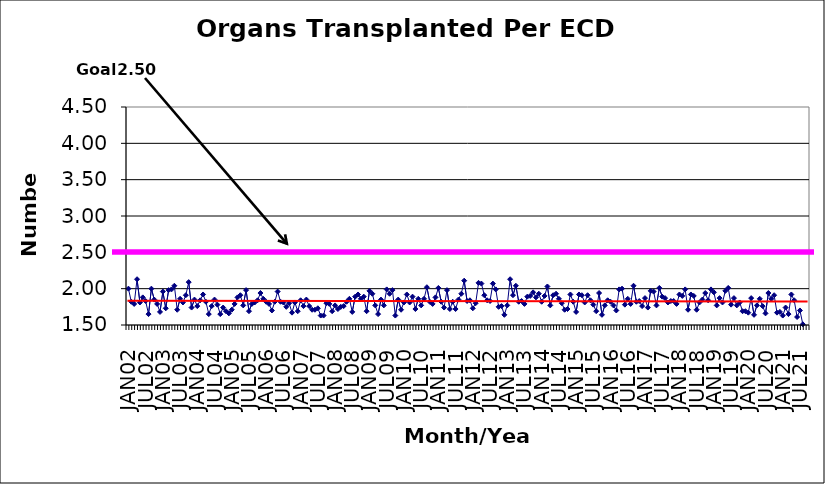
| Category | Series 0 |
|---|---|
| JAN02 | 2 |
| FEB02 | 1.82 |
| MAR02 | 1.79 |
| APR02 | 2.13 |
| MAY02 | 1.81 |
| JUN02 | 1.88 |
| JUL02 | 1.83 |
| AUG02 | 1.65 |
| SEP02 | 2 |
| OCT02 | 1.85 |
| NOV02 | 1.79 |
| DEC02 | 1.68 |
| JAN03 | 1.96 |
| FEB03 | 1.73 |
| MAR03 | 1.98 |
| APR03 | 1.99 |
| MAY03 | 2.04 |
| JUN03 | 1.71 |
| JUL03 | 1.86 |
| AUG03 | 1.81 |
| SEP03 | 1.91 |
| OCT03 | 2.09 |
| NOV03 | 1.74 |
| DEC03 | 1.85 |
| JAN04 | 1.76 |
| FEB04 | 1.84 |
| MAR04 | 1.92 |
| APR04 | 1.82 |
| MAY04 | 1.65 |
| JUN04 | 1.76 |
| JUL04 | 1.85 |
| AUG04 | 1.78 |
| SEP04 | 1.65 |
| OCT04 | 1.74 |
| NOV04 | 1.69 |
| DEC04 | 1.66 |
| JAN05 | 1.71 |
| FEB05 | 1.79 |
| MAR05 | 1.88 |
| APR05 | 1.91 |
| MAY05 | 1.77 |
| JUN05 | 1.98 |
| JUL05 | 1.69 |
| AUG05 | 1.79 |
| SEP05 | 1.81 |
| OCT05 | 1.84 |
| NOV05 | 1.94 |
| DEC05 | 1.86 |
| JAN06 | 1.82 |
| FEB06 | 1.79 |
| MAR06 | 1.7 |
| APR06 | 1.82 |
| MAY06 | 1.96 |
| JUN06 | 1.82 |
| JUL06 | 1.81 |
| AUG06 | 1.75 |
| SEP06 | 1.8 |
| OCT06 | 1.67 |
| NOV06 | 1.81 |
| DEC06 | 1.69 |
| JAN07 | 1.84 |
| FEB07 | 1.76 |
| MAR07 | 1.85 |
| APR07 | 1.76 |
| MAY07 | 1.71 |
| JUN07 | 1.71 |
| JUL07 | 1.73 |
| AUG07 | 1.63 |
| SEP07 | 1.63 |
| OCT07 | 1.8 |
| NOV07 | 1.79 |
| DEC07 | 1.69 |
| JAN08 | 1.77 |
| FEB08 | 1.72 |
| MAR08 | 1.75 |
| APR08 | 1.76 |
| MAY08 | 1.82 |
| JUN08 | 1.86 |
| JUL08 | 1.68 |
| AUG08 | 1.89 |
| SEP08 | 1.92 |
| OCT08 | 1.86 |
| NOV08 | 1.89 |
| DEC08 | 1.69 |
| JAN09 | 1.97 |
| FEB09 | 1.93 |
| MAR09 | 1.77 |
| APR09 | 1.65 |
| MAY09 | 1.85 |
| JUN09 | 1.77 |
| JUL09 | 1.99 |
| AUG09 | 1.93 |
| SEP09 | 1.98 |
| OCT09 | 1.63 |
| NOV09 | 1.85 |
| DEC09 | 1.71 |
| JAN10 | 1.81 |
| FEB10 | 1.92 |
| MAR10 | 1.81 |
| APR10 | 1.89 |
| MAY10 | 1.72 |
| JUN10 | 1.86 |
| JUL10 | 1.77 |
| AUG10 | 1.86 |
| SEP10 | 2.02 |
| OCT10 | 1.82 |
| NOV10 | 1.79 |
| DEC10 | 1.88 |
| JAN11 | 2.01 |
| FEB11 | 1.82 |
| MAR11 | 1.74 |
| APR11 | 1.98 |
| MAY11 | 1.72 |
| JUN11 | 1.82 |
| JUL11 | 1.72 |
| AUG11 | 1.85 |
| SEP11 | 1.93 |
| OCT11 | 2.11 |
| NOV11 | 1.83 |
| DEC11 | 1.84 |
| JAN12 | 1.73 |
| FEB12 | 1.8 |
| MAR12 | 2.08 |
| APR12 | 2.07 |
| MAY12 | 1.91 |
| JUN12 | 1.84 |
| JUL12 | 1.83 |
| AUG12 | 2.07 |
| SEP12 | 1.99 |
| OCT12 | 1.75 |
| NOV12 | 1.76 |
| DEC12 | 1.64 |
| JAN13 | 1.77 |
| FEB13 | 2.13 |
| MAR13 | 1.91 |
| APR13 | 2.04 |
| MAY13 | 1.82 |
| JUN13 | 1.83 |
| JUL13 | 1.79 |
| AUG13 | 1.89 |
| SEP13 | 1.9 |
| OCT13 | 1.95 |
| NOV13 | 1.88 |
| DEC13 | 1.93 |
| JAN14 | 1.82 |
| FEB14 | 1.9 |
| MAR14 | 2.03 |
| APR14 | 1.77 |
| MAY14 | 1.91 |
| JUN14 | 1.93 |
| JUL14 | 1.86 |
| AUG14 | 1.8 |
| SEP14 | 1.71 |
| OCT14 | 1.72 |
| NOV14 | 1.92 |
| DEC14 | 1.82 |
| JAN15 | 1.68 |
| FEB15 | 1.92 |
| MAR15 | 1.91 |
| APR15 | 1.81 |
| MAY15 | 1.91 |
| JUN15 | 1.84 |
| JUL15 | 1.78 |
| AUG15 | 1.69 |
| SEP15 | 1.94 |
| OCT15 | 1.64 |
| NOV15 | 1.77 |
| DEC15 | 1.84 |
| JAN16 | 1.82 |
| FEB16 | 1.77 |
| MAR16 | 1.7 |
| APR16 | 1.99 |
| MAY16 | 2 |
| JUN16 | 1.78 |
| JUL16 | 1.86 |
| AUG16 | 1.79 |
| SEP16 | 2.04 |
| OCT16 | 1.82 |
| NOV16 | 1.83 |
| DEC16 | 1.76 |
| JAN17 | 1.87 |
| FEB17 | 1.74 |
| MAR17 | 1.97 |
| APR17 | 1.96 |
| MAY17 | 1.77 |
| JUN17 | 2.01 |
| JUL17 | 1.89 |
| AUG17 | 1.87 |
| SEP17 | 1.81 |
| OCT17 | 1.83 |
| NOV17 | 1.83 |
| DEC17 | 1.79 |
| JAN18 | 1.92 |
| FEB18 | 1.9 |
| MAR18 | 1.99 |
| APR18 | 1.71 |
| MAY18 | 1.92 |
| JUN18 | 1.9 |
| JUL18 | 1.71 |
| AUG18 | 1.81 |
| SEP18 | 1.85 |
| OCT18 | 1.94 |
| NOV18 | 1.84 |
| DEC18 | 1.99 |
| JAN19 | 1.95 |
| FEB19 | 1.77 |
| MAR19 | 1.87 |
| APR19 | 1.81 |
| MAY19 | 1.97 |
| JUN19 | 2.01 |
| JUL19 | 1.78 |
| AUG19 | 1.87 |
| SEP19 | 1.77 |
| OCT19 | 1.81 |
| NOV19 | 1.69 |
| DEC19 | 1.69 |
| JAN20 | 1.67 |
| FEB20 | 1.87 |
| MAR20 | 1.64 |
| APR20 | 1.77 |
| MAY20 | 1.86 |
| JUN20 | 1.76 |
| JUL20 | 1.66 |
| AUG20 | 1.94 |
| SEP20 | 1.86 |
| OCT20 | 1.91 |
| NOV20 | 1.67 |
| DEC20 | 1.68 |
| JAN21 | 1.63 |
| FEB21 | 1.74 |
| MAR21 | 1.65 |
| APR21 | 1.92 |
| MAY21 | 1.84 |
| JUN21 | 1.61 |
| JUL21 | 1.7 |
| AUG21 | 1.51 |